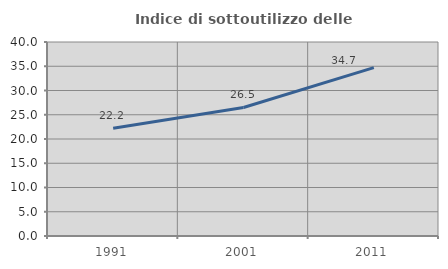
| Category | Indice di sottoutilizzo delle abitazioni  |
|---|---|
| 1991.0 | 22.225 |
| 2001.0 | 26.501 |
| 2011.0 | 34.722 |